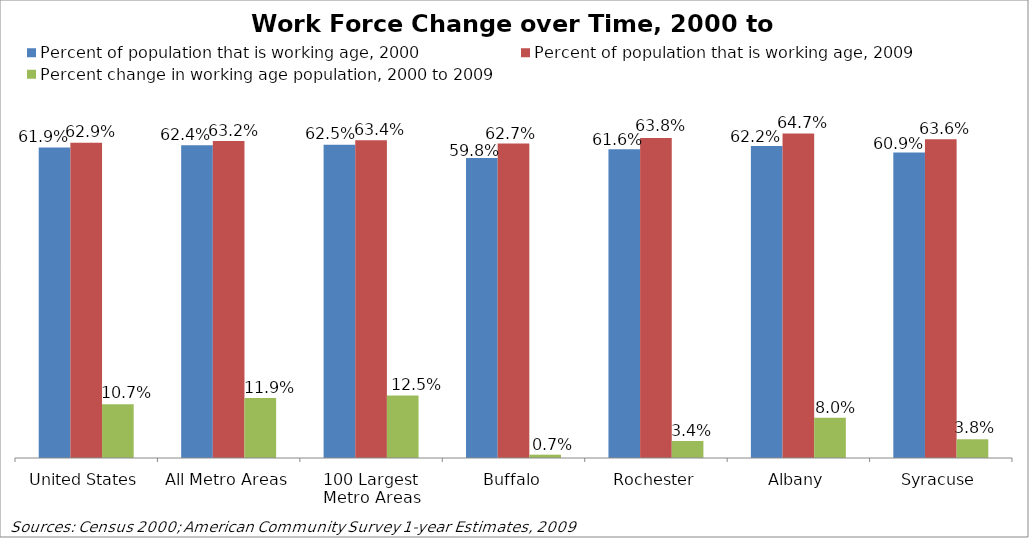
| Category | Percent of population that is working age, 2000 | Percent of population that is working age, 2009 | Percent change in working age population, 2000 to 2009 |
|---|---|---|---|
| United States | 0.619 | 0.629 | 0.107 |
| All Metro Areas | 0.624 | 0.632 | 0.119 |
| 100 Largest Metro Areas | 0.625 | 0.634 | 0.125 |
| Buffalo | 0.598 | 0.627 | 0.007 |
| Rochester | 0.616 | 0.638 | 0.034 |
| Albany | 0.622 | 0.647 | 0.08 |
| Syracuse | 0.609 | 0.636 | 0.038 |